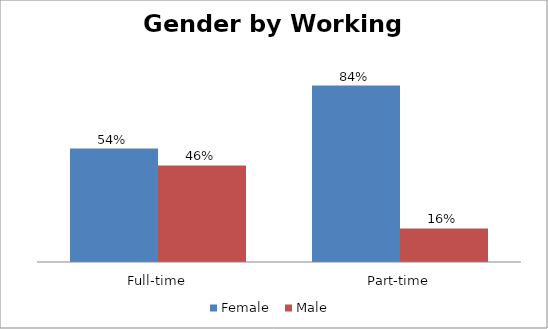
| Category | Female | Male |
|---|---|---|
| Full-time | 0.54 | 0.46 |
| Part-time | 0.84 | 0.16 |